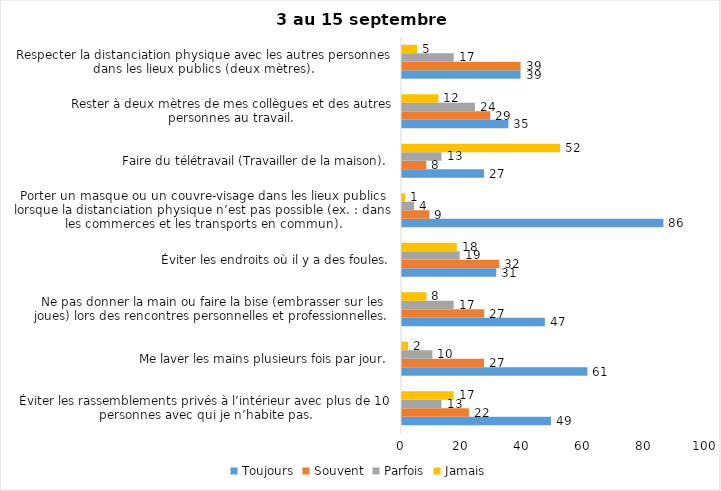
| Category | Toujours | Souvent | Parfois | Jamais |
|---|---|---|---|---|
| Éviter les rassemblements privés à l’intérieur avec plus de 10 personnes avec qui je n’habite pas. | 49 | 22 | 13 | 17 |
| Me laver les mains plusieurs fois par jour. | 61 | 27 | 10 | 2 |
| Ne pas donner la main ou faire la bise (embrasser sur les joues) lors des rencontres personnelles et professionnelles. | 47 | 27 | 17 | 8 |
| Éviter les endroits où il y a des foules. | 31 | 32 | 19 | 18 |
| Porter un masque ou un couvre-visage dans les lieux publics lorsque la distanciation physique n’est pas possible (ex. : dans les commerces et les transports en commun). | 86 | 9 | 4 | 1 |
| Faire du télétravail (Travailler de la maison). | 27 | 8 | 13 | 52 |
| Rester à deux mètres de mes collègues et des autres personnes au travail. | 35 | 29 | 24 | 12 |
| Respecter la distanciation physique avec les autres personnes dans les lieux publics (deux mètres). | 39 | 39 | 17 | 5 |